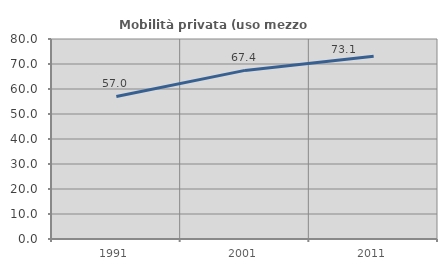
| Category | Mobilità privata (uso mezzo privato) |
|---|---|
| 1991.0 | 57.008 |
| 2001.0 | 67.445 |
| 2011.0 | 73.092 |